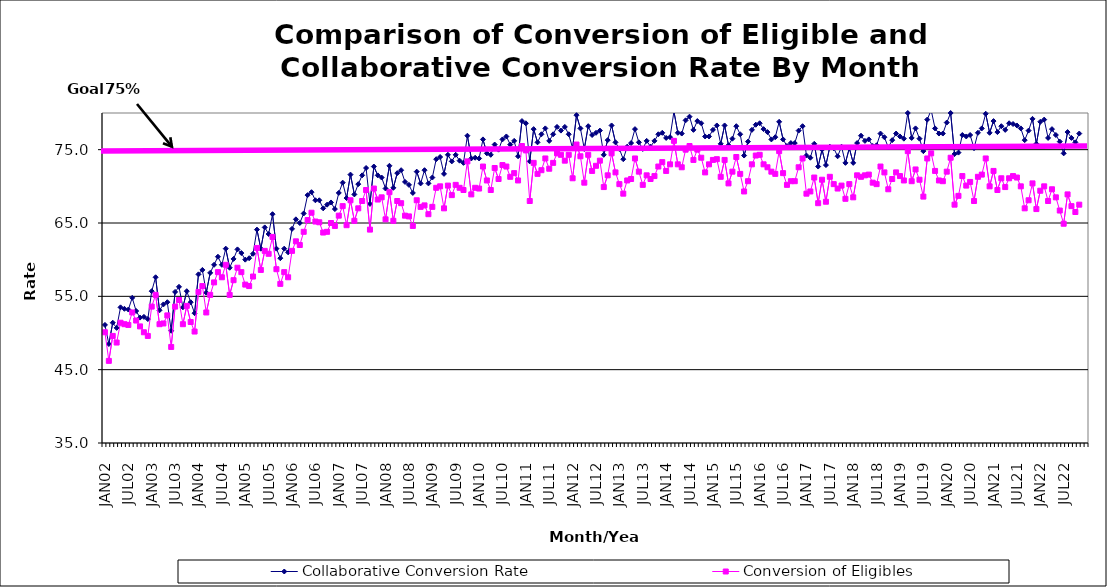
| Category | Collaborative Conversion Rate | Conversion of Eligibles |
|---|---|---|
| JAN02 | 51.1 | 50.1 |
| FEB02 | 48.5 | 46.2 |
| MAR02 | 51.4 | 49.6 |
| APR02 | 50.7 | 48.7 |
| MAY02 | 53.5 | 51.4 |
| JUN02 | 53.3 | 51.2 |
| JUL02 | 53.2 | 51.1 |
| AUG02 | 54.8 | 52.8 |
| SEP02 | 53 | 51.7 |
| OCT02 | 52.1 | 50.9 |
| NOV02 | 52.2 | 50.1 |
| DEC02 | 51.9 | 49.6 |
| JAN03 | 55.7 | 53.6 |
| FEB03 | 57.6 | 55.2 |
| MAR03 | 53.1 | 51.2 |
| APR03 | 53.9 | 51.3 |
| MAY03 | 54.2 | 52.4 |
| JUN03 | 50.3 | 48.1 |
| JUL03 | 55.6 | 53.6 |
| AUG03 | 56.3 | 54.5 |
| SEP03 | 53.5 | 51.2 |
| OCT03 | 55.7 | 53.7 |
| NOV03 | 54.2 | 51.5 |
| DEC03 | 52.7 | 50.2 |
| JAN04 | 58 | 55.6 |
| FEB04 | 58.6 | 56.4 |
| MAR04 | 55.5 | 52.8 |
| APR04 | 58.2 | 55.2 |
| MAY04 | 59.3 | 56.9 |
| JUN04 | 60.4 | 58.3 |
| JUL04 | 59.3 | 57.6 |
| AUG04 | 61.5 | 59.3 |
| SEP04 | 58.9 | 55.2 |
| OCT04 | 60.1 | 57.2 |
| NOV04 | 61.4 | 58.9 |
| DEC04 | 60.9 | 58.3 |
| JAN05 | 60 | 56.6 |
| FEB05 | 60.2 | 56.4 |
| MAR05 | 60.8 | 57.7 |
| APR05 | 64.1 | 61.6 |
| MAY05 | 61.5 | 58.6 |
| JUN05 | 64.4 | 61.2 |
| JUL05 | 63.5 | 60.8 |
| AUG05 | 66.2 | 63.1 |
| SEP05 | 61.5 | 58.7 |
| OCT05 | 60.2 | 56.7 |
| NOV05 | 61.5 | 58.3 |
| DEC05 | 61 | 57.6 |
| JAN06 | 64.2 | 61.2 |
| FEB06 | 65.5 | 62.5 |
| MAR06 | 65 | 62 |
| APR06 | 66.3 | 63.8 |
| MAY06 | 68.8 | 65.4 |
| JUN06 | 69.2 | 66.4 |
| JUL06 | 68.1 | 65.2 |
| AUG06 | 68.1 | 65.1 |
| SEP06 | 67 | 63.7 |
| OCT06 | 67.5 | 63.8 |
| NOV06 | 67.8 | 65 |
| DEC06 | 66.9 | 64.6 |
| JAN07 | 69.1 | 66 |
| FEB07 | 70.5 | 67.3 |
| MAR07 | 68.4 | 64.7 |
| APR07 | 71.6 | 68.1 |
| MAY07 | 68.9 | 65.3 |
| JUN07 | 70.3 | 67 |
| JUL07 | 71.5 | 68 |
| AUG07 | 72.5 | 69.5 |
| SEP07 | 67.6 | 64.1 |
| OCT07 | 72.7 | 69.7 |
| NOV07 | 71.5 | 68.2 |
| DEC07 | 71.2 | 68.5 |
| JAN08 | 69.7 | 65.5 |
| FEB08 | 72.8 | 69.2 |
| MAR08 | 69.8 | 65.3 |
| APR08 | 71.8 | 68 |
| MAY08 | 72.2 | 67.7 |
| JUN08 | 70.6 | 66 |
| JUL08 | 70.2 | 65.9 |
| AUG08 | 69.1 | 64.6 |
| SEP08 | 72 | 68.1 |
| OCT08 | 70.4 | 67.2 |
| NOV08 | 72.2 | 67.4 |
| DEC08 | 70.4 | 66.2 |
| JAN09 | 71.2 | 67.2 |
| FEB09 | 73.7 | 69.8 |
| MAR09 | 74 | 70 |
| APR09 | 71.7 | 67 |
| MAY09 | 74.3 | 70.1 |
| JUN09 | 73.4 | 68.8 |
| JUL09 | 74.3 | 70.2 |
| AUG09 | 73.5 | 69.8 |
| SEP09 | 73.2 | 69.5 |
| OCT09 | 76.9 | 73.4 |
| NOV09 | 73.8 | 68.9 |
| DEC09 | 73.9 | 69.8 |
| JAN10 | 73.8 | 69.7 |
| FEB10 | 76.4 | 72.7 |
| MAR10 | 74.5 | 70.8 |
| APR10 | 74.3 | 69.5 |
| MAY10 | 75.7 | 72.5 |
| JUN10 | 75 | 71 |
| JUL10 | 76.4 | 72.9 |
| AUG10 | 76.8 | 72.7 |
| SEP10 | 75.7 | 71.3 |
| OCT10 | 76.2 | 71.8 |
| NOV10 | 74.1 | 70.8 |
| DEC10 | 78.9 | 75.5 |
| JAN11 | 78.6 | 74.9 |
| FEB11 | 73.4 | 68 |
| MAR11 | 77.8 | 73.2 |
| APR11 | 76 | 71.7 |
| MAY11 | 77.1 | 72.2 |
| JUN11 | 77.9 | 73.8 |
| JUL11 | 76.2 | 72.4 |
| AUG11 | 77.1 | 73.2 |
| SEP11 | 78.1 | 74.5 |
| OCT11 | 77.6 | 74.3 |
| NOV11 | 78.1 | 73.5 |
| DEC11 | 77.1 | 74.3 |
| JAN12 | 75.2 | 71.1 |
| FEB12 | 79.7 | 75.7 |
| MAR12 | 77.9 | 74.1 |
| APR12 | 75.1 | 70.5 |
| MAY12 | 78.2 | 74.3 |
| JUN12 | 77 | 72.1 |
| JUL12 | 77.3 | 72.8 |
| AUG12 | 77.6 | 73.5 |
| SEP12 | 74.3 | 69.9 |
| OCT12 | 76.3 | 71.5 |
| NOV12 | 78.3 | 74.5 |
| DEC12 | 76 | 71.9 |
| JAN13 | 75.1 | 70.3 |
| FEB13 | 73.7 | 69 |
| MAR13 | 75.4 | 70.8 |
| APR13 | 75.9 | 71 |
| MAY13 | 77.8 | 73.8 |
| JUN13 | 76 | 72 |
| JUL13 | 75.1 | 70.2 |
| AUG13 | 76.2 | 71.5 |
| SEP13 | 75.4 | 71 |
| OCT13 | 76.2 | 71.4 |
| NOV13 | 77.1 | 72.7 |
| DEC13 | 77.3 | 73.3 |
| JAN14 | 76.6 | 72.1 |
| FEB14 | 76.7 | 73 |
| MAR14 | 80.2 | 76.2 |
| APR14 | 77.3 | 73 |
| MAY14 | 77.2 | 72.6 |
| JUN14 | 79 | 75 |
| JUL14 | 79.5 | 75.5 |
| AUG14 | 77.7 | 73.6 |
| SEP14 | 78.9 | 75 |
| OCT14 | 78.6 | 73.9 |
| NOV14 | 76.8 | 71.9 |
| DEC14 | 76.8 | 73 |
| JAN15 | 77.7 | 73.6 |
| FEB15 | 78.3 | 73.7 |
| MAR15 | 75.8 | 71.3 |
| APR15 | 78.3 | 73.6 |
| MAY15 | 75.6 | 70.4 |
| JUN15 | 76.5 | 72 |
| JUL15 | 78.2 | 74 |
| AUG15 | 77.1 | 71.7 |
| SEP15 | 74.2 | 69.3 |
| OCT15 | 76.1 | 70.7 |
| NOV15 | 77.7 | 73 |
| DEC15 | 78.4 | 74.2 |
| JAN16 | 78.6 | 74.3 |
| FEB16 | 77.8 | 73 |
| MAR16 | 77.4 | 72.6 |
| APR16 | 76.4 | 72 |
| MAY16 | 76.7 | 71.7 |
| JUN16 | 78.8 | 74.8 |
| JUL16 | 76.4 | 71.8 |
| AUG16 | 75.5 | 70.2 |
| SEP16 | 75.9 | 70.7 |
| OCT16 | 75.9 | 70.7 |
| NOV16 | 77.6 | 72.6 |
| DEC16 | 78.2 | 73.8 |
| JAN17 | 74.2 | 69 |
| FEB17 | 73.9 | 69.3 |
| MAR17 | 75.8 | 71.2 |
| APR17 | 72.7 | 67.7 |
| MAY17 | 75 | 70.9 |
| JUN17 | 72.9 | 67.9 |
| JUL17 | 75.4 | 71.3 |
| AUG17 | 75.2 | 70.3 |
| SEP17 | 74.1 | 69.7 |
| OCT17 | 75.4 | 70.1 |
| NOV17 | 73.2 | 68.3 |
| DEC17 | 75.2 | 70.3 |
| JAN18 | 73.2 | 68.5 |
| FEB18 | 75.9 | 71.5 |
| MAR18 | 76.9 | 71.3 |
| APR18 | 76.2 | 71.5 |
| MAY18 | 76.4 | 71.6 |
| JUN18 | 75.5 | 70.5 |
| JUL18 | 75.6 | 70.3 |
| AUG18 | 77.2 | 72.7 |
| SEP18 | 76.7 | 71.9 |
| OCT18 | 75.3 | 69.6 |
| NOV18 | 76.3 | 71 |
| DEC18 | 77.2 | 71.9 |
| JAN19 | 76.8 | 71.4 |
| FEB19 | 76.5 | 70.8 |
| MAR19 | 80 | 74.8 |
| APR19 | 76.6 | 70.7 |
| MAY19 | 77.9 | 72.3 |
| JUN19 | 76.5 | 70.9 |
| JUL19 | 74.8 | 68.6 |
| AUG19 | 79.1 | 73.8 |
| SEP19 | 80.4 | 74.5 |
| OCT19 | 77.9 | 72.1 |
| NOV19 | 77.2 | 70.8 |
| DEC19 | 77.2 | 70.7 |
| JAN20 | 78.7 | 72 |
| FEB20 | 80 | 73.9 |
| MAR20 | 74.4 | 67.5 |
| APR20 | 74.6 | 68.7 |
| MAY20 | 77 | 71.4 |
| JUN20 | 76.8 | 70.1 |
| JUL20 | 77 | 70.6 |
| AUG20 | 75.2 | 68 |
| SEP20 | 77.3 | 71.3 |
| OCT20 | 77.9 | 71.6 |
| NOV20 | 79.9 | 73.8 |
| DEC20 | 77.3 | 70 |
| JAN21 | 78.9 | 72.1 |
| FEB21 | 77.4 | 69.5 |
| MAR21 | 78.2 | 71.1 |
| APR21 | 77.7 | 69.9 |
| MAY21 | 78.6 | 71.1 |
| JUN21 | 78.5 | 71.4 |
| JUL21 | 78.3 | 71.2 |
| AUG21 | 77.9 | 70 |
| SEP21 | 76.3 | 67 |
| OCT21 | 77.6 | 68.1 |
| NOV21 | 79.2 | 70.4 |
| DEC21 | 75.8 | 66.9 |
| JAN22 | 78.8 | 69.4 |
| FEB22 | 79.1 | 70 |
| MAR22 | 76.6 | 68 |
| APR22 | 77.8 | 69.6 |
| MAY22 | 77 | 68.5 |
| JUN22 | 76.1 | 66.7 |
| JUL22 | 74.5 | 64.9 |
| AUG22 | 77.4 | 68.9 |
| SEP22 | 76.6 | 67.3 |
| OCT22 | 76 | 66.5 |
| NOV22 | 77.2 | 67.5 |